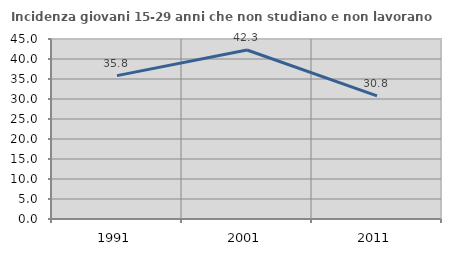
| Category | Incidenza giovani 15-29 anni che non studiano e non lavorano  |
|---|---|
| 1991.0 | 35.849 |
| 2001.0 | 42.254 |
| 2011.0 | 30.789 |